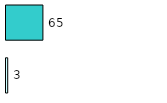
| Category | Series 0 | Series 1 |
|---|---|---|
| 0 | 3 | 65 |